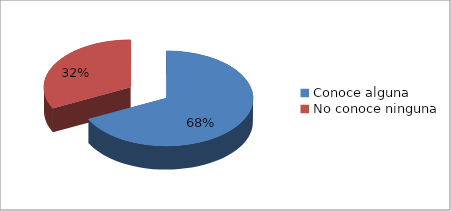
| Category | Series 0 |
|---|---|
| Conoce alguna  | 0.677 |
| No conoce ninguna | 0.323 |